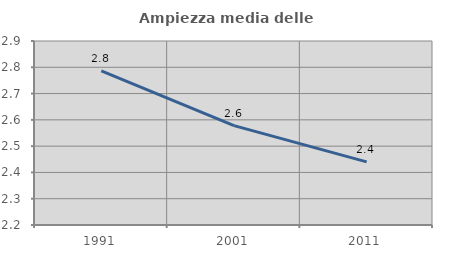
| Category | Ampiezza media delle famiglie |
|---|---|
| 1991.0 | 2.786 |
| 2001.0 | 2.578 |
| 2011.0 | 2.44 |